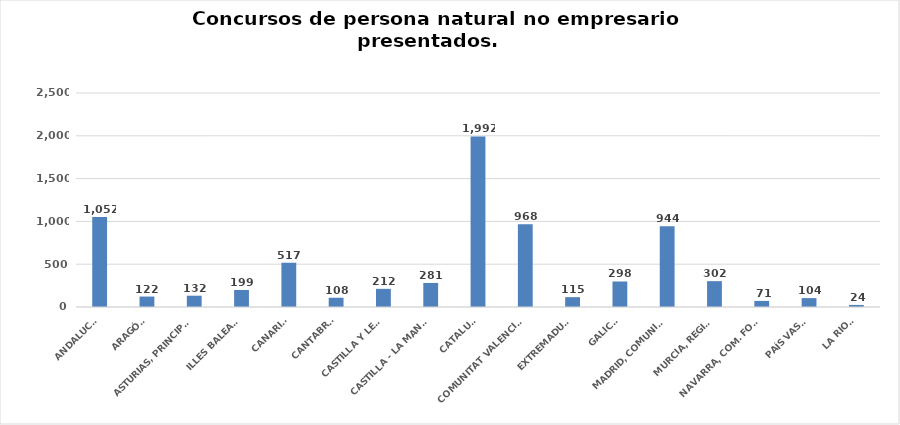
| Category | Series 0 |
|---|---|
| ANDALUCÍA | 1052 |
| ARAGÓN | 122 |
| ASTURIAS, PRINCIPADO | 132 |
| ILLES BALEARS | 199 |
| CANARIAS | 517 |
| CANTABRIA | 108 |
| CASTILLA Y LEÓN | 212 |
| CASTILLA - LA MANCHA | 281 |
| CATALUÑA | 1992 |
| COMUNITAT VALENCIANA | 968 |
| EXTREMADURA | 115 |
| GALICIA | 298 |
| MADRID, COMUNIDAD | 944 |
| MURCIA, REGIÓN | 302 |
| NAVARRA, COM. FORAL | 71 |
| PAÍS VASCO | 104 |
| LA RIOJA | 24 |